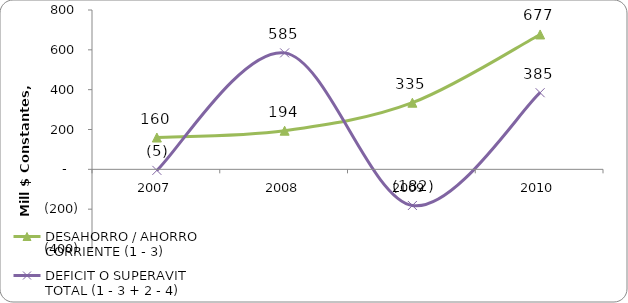
| Category | DESAHORRO / AHORRO CORRIENTE (1 - 3) | DEFICIT O SUPERAVIT TOTAL (1 - 3 + 2 - 4) |
|---|---|---|
| 2007 | 159.709 | -5.272 |
| 2008 | 193.934 | 584.686 |
| 2009 | 334.544 | -181.572 |
| 2010 | 677.156 | 384.731 |